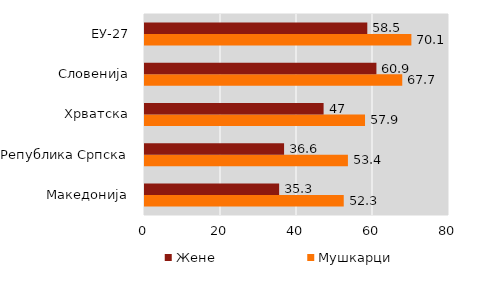
| Category | Мушкарци | Жене |
|---|---|---|
| Македонија | 52.3 | 35.3 |
| Република Српска | 53.4 | 36.6 |
| Хрватска | 57.9 | 47 |
| Словенија | 67.7 | 60.9 |
| ЕУ-27 | 70.1 | 58.5 |